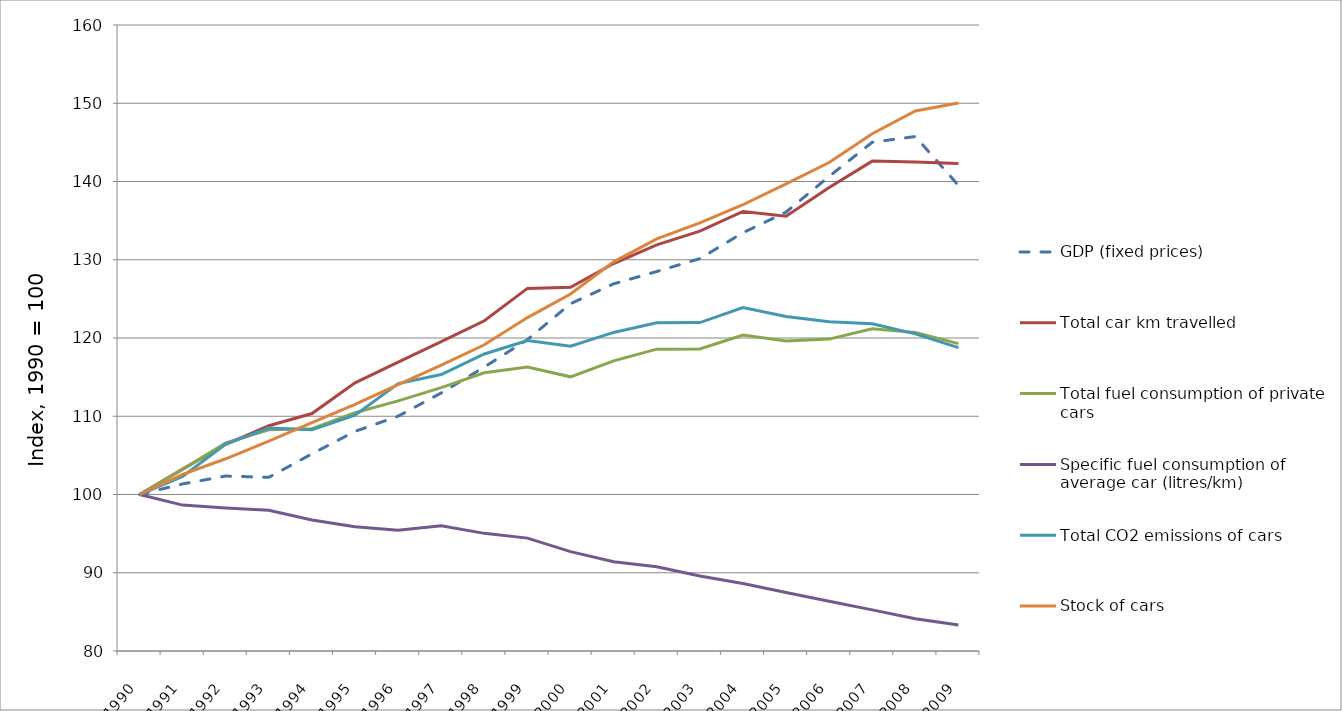
| Category | GDP (fixed prices) | Total car km travelled | Total fuel consumption of private cars | Specific fuel consumption of average car (litres/km) | Total CO2 emissions of cars | Stock of cars |
|---|---|---|---|---|---|---|
| 1990.0 | 100 | 100 | 100 | 100 | 100 | 100 |
| 1991.0 | 101.353 | 103.248 | 103.22 | 98.644 | 102.302 | 102.561 |
| 1992.0 | 102.357 | 106.414 | 106.595 | 98.27 | 106.453 | 104.565 |
| 1993.0 | 102.195 | 108.791 | 108.273 | 97.99 | 108.481 | 106.82 |
| 1994.0 | 105.196 | 110.35 | 108.418 | 96.751 | 108.261 | 109.193 |
| 1995.0 | 108.068 | 114.273 | 110.45 | 95.886 | 110.137 | 111.53 |
| 1996.0 | 110.008 | 116.906 | 111.965 | 95.442 | 114.18 | 114.037 |
| 1997.0 | 112.978 | 119.525 | 113.654 | 96.003 | 115.333 | 116.542 |
| 1998.0 | 116.288 | 122.204 | 115.561 | 95.033 | 117.959 | 119.135 |
| 1999.0 | 119.796 | 126.337 | 116.295 | 94.426 | 119.687 | 122.61 |
| 2000.0 | 124.382 | 126.472 | 115.038 | 92.696 | 118.941 | 125.615 |
| 2001.0 | 126.926 | 129.519 | 117.074 | 91.399 | 120.714 | 129.733 |
| 2002.0 | 128.495 | 131.896 | 118.578 | 90.768 | 121.936 | 132.662 |
| 2003.0 | 130.144 | 133.652 | 118.593 | 89.576 | 121.967 | 134.704 |
| 2004.0 | 133.452 | 136.175 | 120.382 | 88.618 | 123.898 | 137.029 |
| 2005.0 | 136.086 | 135.573 | 119.613 | 87.472 | 122.755 | 139.708 |
| 2006.0 | 140.656 | 139.241 | 119.859 | 86.362 | 122.067 | 142.43 |
| 2007.0 | 145.016 | 142.606 | 121.189 | 85.252 | 121.824 | 146.098 |
| 2008.0 | 145.75 | 142.484 | 120.694 | 84.13 | 120.528 | 149.019 |
| 2009.0 | 139.495 | 142.304 | 119.281 | 83.312 | 118.768 | 150.022 |